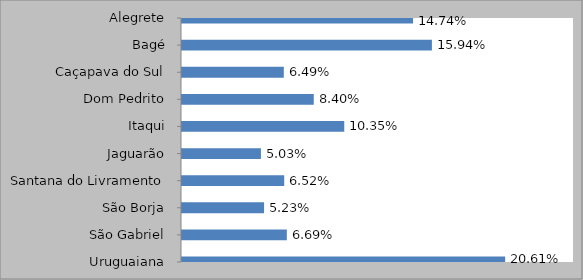
| Category | MATRIZ
(% de Alunos Equivalentes) |
|---|---|
| Alegrete | 0.147 |
| Bagé | 0.159 |
| Caçapava do Sul | 0.065 |
| Dom Pedrito | 0.084 |
| Itaqui | 0.103 |
| Jaguarão | 0.05 |
| Santana do Livramento | 0.065 |
| São Borja | 0.052 |
| São Gabriel | 0.067 |
| Uruguaiana | 0.206 |